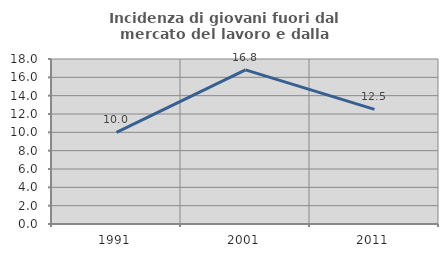
| Category | Incidenza di giovani fuori dal mercato del lavoro e dalla formazione  |
|---|---|
| 1991.0 | 10 |
| 2001.0 | 16.812 |
| 2011.0 | 12.5 |